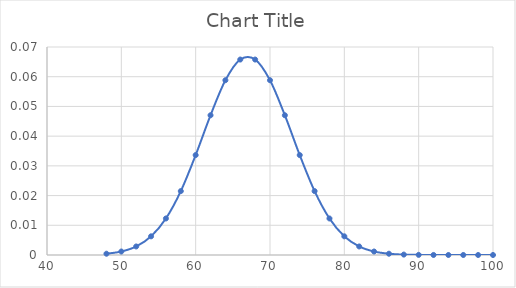
| Category | Series 0 |
|---|---|
| 48.0 | 0 |
| 50.0 | 0.001 |
| 52.0 | 0.003 |
| 54.0 | 0.006 |
| 56.0 | 0.012 |
| 58.0 | 0.021 |
| 60.0 | 0.034 |
| 62.0 | 0.047 |
| 64.0 | 0.059 |
| 66.0 | 0.066 |
| 68.0 | 0.066 |
| 70.0 | 0.059 |
| 72.0 | 0.047 |
| 74.0 | 0.034 |
| 76.0 | 0.021 |
| 78.0 | 0.012 |
| 80.0 | 0.006 |
| 82.0 | 0.003 |
| 84.0 | 0.001 |
| 86.0 | 0 |
| 88.0 | 0 |
| 90.0 | 0 |
| 92.0 | 0 |
| 94.0 | 0 |
| 96.0 | 0 |
| 98.0 | 0 |
| 100.0 | 0 |